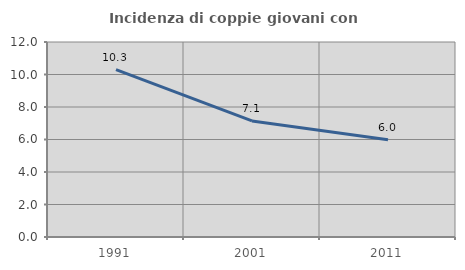
| Category | Incidenza di coppie giovani con figli |
|---|---|
| 1991.0 | 10.294 |
| 2001.0 | 7.143 |
| 2011.0 | 5.991 |